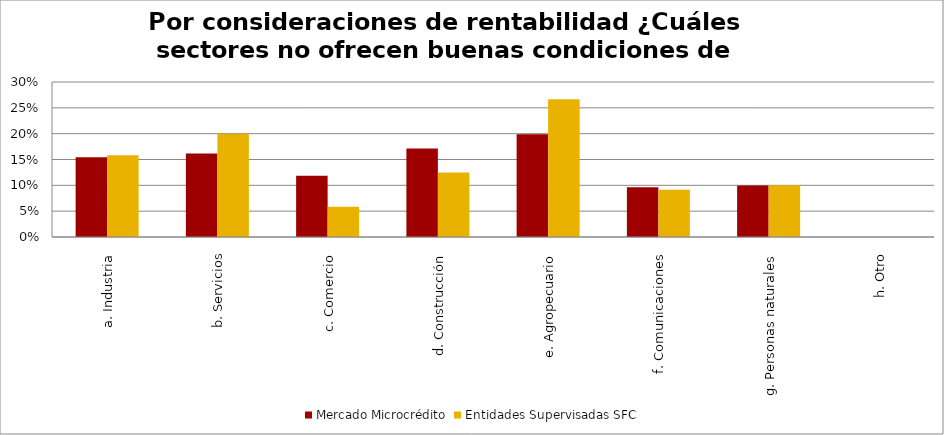
| Category | Mercado Microcrédito | Entidades Supervisadas SFC |
|---|---|---|
| a. Industria | 0.154 | 0.158 |
| b. Servicios | 0.161 | 0.2 |
| c. Comercio | 0.119 | 0.058 |
| d. Construcción | 0.171 | 0.125 |
| e. Agropecuario | 0.199 | 0.267 |
| f. Comunicaciones | 0.096 | 0.092 |
| g. Personas naturales | 0.099 | 0.1 |
| h. Otro | 0 | 0 |